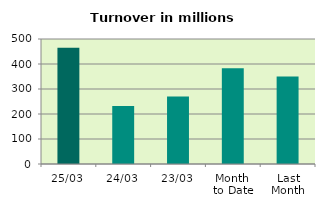
| Category | Series 0 |
|---|---|
| 25/03 | 465.416 |
| 24/03 | 232.467 |
| 23/03 | 270.143 |
| Month 
to Date | 382.508 |
| Last
Month | 349.641 |